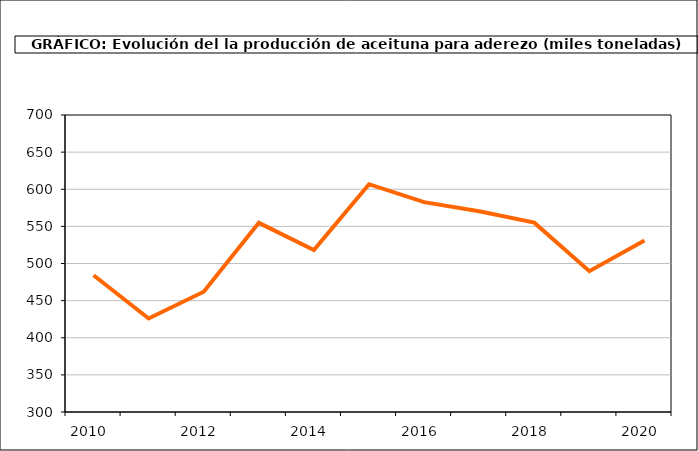
| Category | producción |
|---|---|
| 2010.0 | 484.197 |
| 2011.0 | 425.955 |
| 2012.0 | 461.963 |
| 2013.0 | 554.749 |
| 2014.0 | 518.23 |
| 2015.0 | 606.789 |
| 2016.0 | 582.648 |
| 2017.0 | 570.295 |
| 2018.0 | 555.033 |
| 2019.0 | 489.721 |
| 2020.0 | 531.073 |